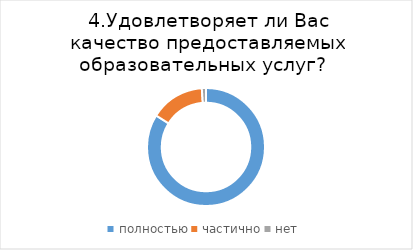
| Category | Series 0 |
|---|---|
| полностью | 83.969 |
| частично | 14.885 |
| нет | 1.145 |